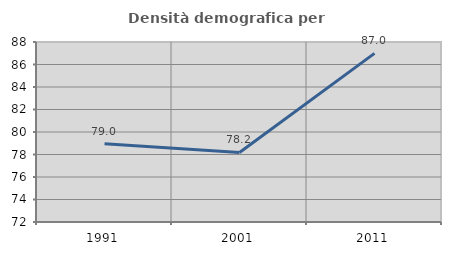
| Category | Densità demografica |
|---|---|
| 1991.0 | 78.955 |
| 2001.0 | 78.185 |
| 2011.0 | 86.991 |